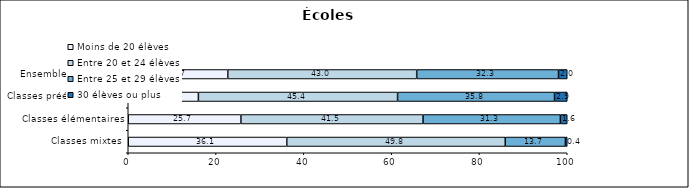
| Category | Moins de 20 élèves | Entre 20 et 24 élèves | Entre 25 et 29 élèves | 30 élèves ou plus |
|---|---|---|---|---|
| Classes mixtes | 36.11 | 49.77 | 13.7 | 0.42 |
| Classes élémentaires | 25.66 | 41.49 | 31.28 | 1.57 |
| Classes préélémentaires | 15.98 | 45.37 | 35.75 | 2.9 |
| Ensemble des classes | 22.67 | 43.04 | 32.3 | 1.99 |